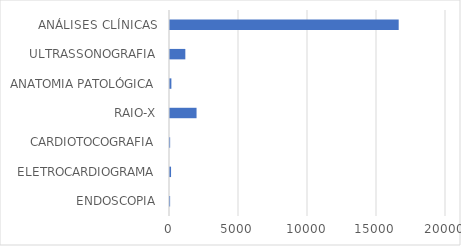
| Category | Series 0 |
|---|---|
| ENDOSCOPIA | 8 |
| ELETROCARDIOGRAMA | 76 |
| CARDIOTOCOGRAFIA | 10 |
| RAIO-X | 1924 |
| ANATOMIA PATOLÓGICA | 100 |
| ULTRASSONOGRAFIA | 1111 |
| ANÁLISES CLÍNICAS | 16572 |